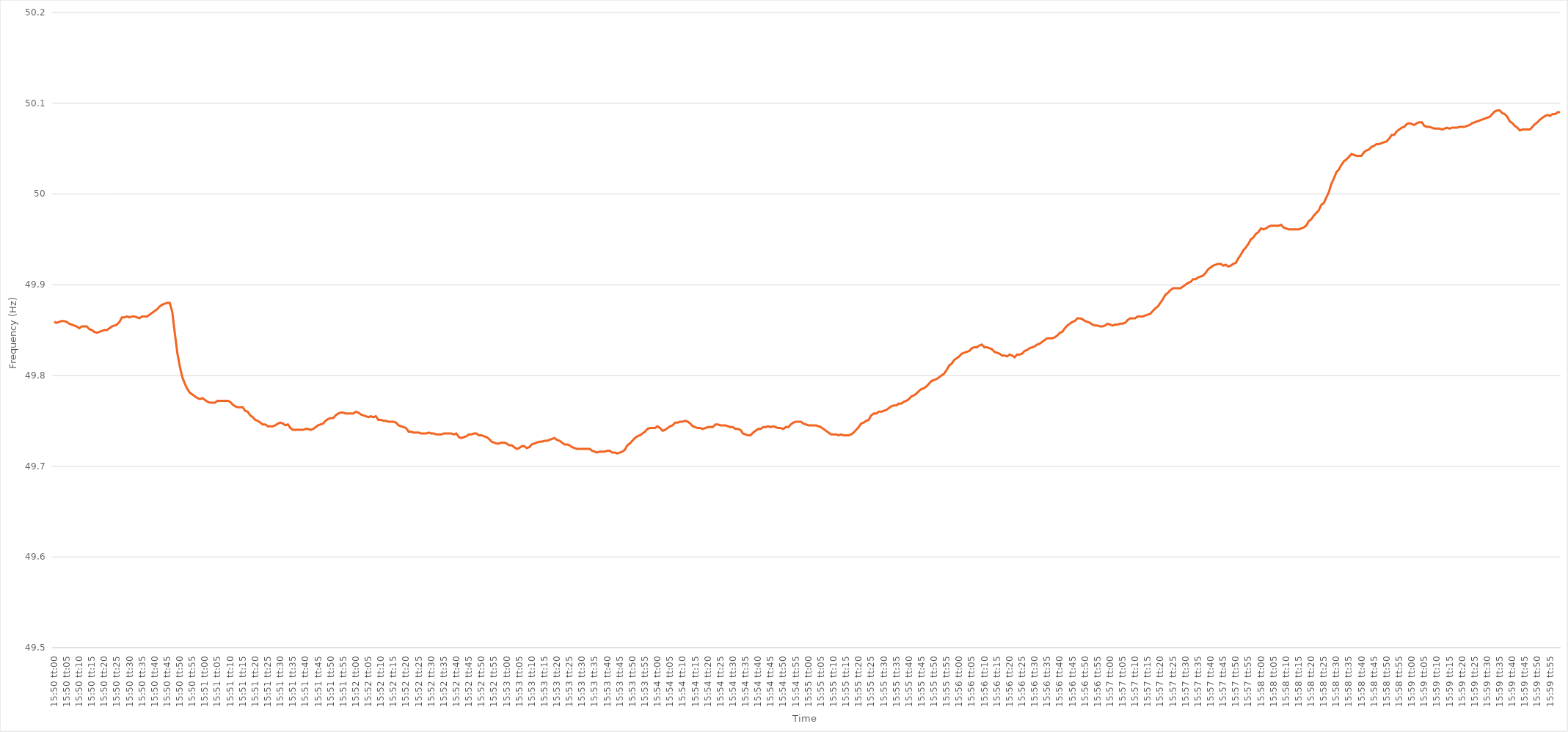
| Category | Series 0 |
|---|---|
| 0.6597222222222222 | 49.859 |
| 0.6597337962962962 | 49.858 |
| 0.6597453703703704 | 49.859 |
| 0.6597569444444444 | 49.86 |
| 0.6597685185185186 | 49.86 |
| 0.6597800925925926 | 49.859 |
| 0.6597916666666667 | 49.857 |
| 0.6598032407407407 | 49.856 |
| 0.6598148148148147 | 49.855 |
| 0.6598263888888889 | 49.854 |
| 0.6598379629629629 | 49.852 |
| 0.6598495370370371 | 49.854 |
| 0.6598611111111111 | 49.854 |
| 0.6598726851851852 | 49.854 |
| 0.6598842592592592 | 49.851 |
| 0.6598958333333333 | 49.85 |
| 0.6599074074074074 | 49.848 |
| 0.6599189814814815 | 49.847 |
| 0.6599305555555556 | 49.848 |
| 0.6599421296296296 | 49.849 |
| 0.6599537037037037 | 49.85 |
| 0.6599652777777778 | 49.85 |
| 0.6599768518518518 | 49.852 |
| 0.659988425925926 | 49.854 |
| 0.66 | 49.855 |
| 0.6600115740740741 | 49.856 |
| 0.6600231481481481 | 49.859 |
| 0.6600347222222223 | 49.864 |
| 0.6600462962962963 | 49.864 |
| 0.6600578703703703 | 49.865 |
| 0.6600694444444445 | 49.864 |
| 0.6600810185185185 | 49.865 |
| 0.6600925925925926 | 49.865 |
| 0.6601041666666666 | 49.864 |
| 0.6601157407407408 | 49.863 |
| 0.6601273148148148 | 49.865 |
| 0.6601388888888889 | 49.865 |
| 0.660150462962963 | 49.865 |
| 0.660162037037037 | 49.867 |
| 0.6601736111111111 | 49.869 |
| 0.6601851851851852 | 49.871 |
| 0.6601967592592592 | 49.873 |
| 0.6602083333333334 | 49.876 |
| 0.6602199074074074 | 49.878 |
| 0.6602314814814815 | 49.879 |
| 0.6602430555555555 | 49.88 |
| 0.6602546296296297 | 49.88 |
| 0.6602662037037037 | 49.87 |
| 0.6602777777777777 | 49.847 |
| 0.6602893518518519 | 49.825 |
| 0.6603009259259259 | 49.81 |
| 0.6603125 | 49.798 |
| 0.660324074074074 | 49.791 |
| 0.6603356481481482 | 49.785 |
| 0.6603472222222222 | 49.781 |
| 0.6603587962962963 | 49.779 |
| 0.6603703703703704 | 49.777 |
| 0.6603819444444444 | 49.775 |
| 0.6603935185185185 | 49.774 |
| 0.6604050925925926 | 49.775 |
| 0.6604166666666667 | 49.773 |
| 0.6604282407407408 | 49.771 |
| 0.6604398148148148 | 49.77 |
| 0.6604513888888889 | 49.77 |
| 0.6604629629629629 | 49.77 |
| 0.6604745370370371 | 49.772 |
| 0.6604861111111111 | 49.772 |
| 0.6604976851851853 | 49.772 |
| 0.6605092592592593 | 49.772 |
| 0.6605208333333333 | 49.772 |
| 0.6605324074074074 | 49.771 |
| 0.6605439814814814 | 49.768 |
| 0.6605555555555556 | 49.766 |
| 0.6605671296296296 | 49.765 |
| 0.6605787037037038 | 49.765 |
| 0.6605902777777778 | 49.765 |
| 0.6606018518518518 | 49.761 |
| 0.6606134259259259 | 49.76 |
| 0.660625 | 49.756 |
| 0.6606365740740741 | 49.754 |
| 0.6606481481481482 | 49.751 |
| 0.6606597222222222 | 49.75 |
| 0.6606712962962963 | 49.748 |
| 0.6606828703703703 | 49.746 |
| 0.6606944444444445 | 49.746 |
| 0.6607060185185185 | 49.744 |
| 0.6607175925925927 | 49.744 |
| 0.6607291666666667 | 49.744 |
| 0.6607407407407407 | 49.745 |
| 0.6607523148148148 | 49.747 |
| 0.6607638888888888 | 49.748 |
| 0.660775462962963 | 49.747 |
| 0.660787037037037 | 49.745 |
| 0.6607986111111112 | 49.746 |
| 0.6608101851851852 | 49.742 |
| 0.6608217592592592 | 49.74 |
| 0.6608333333333333 | 49.74 |
| 0.6608449074074074 | 49.74 |
| 0.6608564814814815 | 49.74 |
| 0.6608680555555556 | 49.74 |
| 0.6608796296296297 | 49.741 |
| 0.6608912037037037 | 49.741 |
| 0.6609027777777777 | 49.74 |
| 0.6609143518518519 | 49.741 |
| 0.6609259259259259 | 49.743 |
| 0.6609375000000001 | 49.745 |
| 0.6609490740740741 | 49.746 |
| 0.6609606481481481 | 49.747 |
| 0.6609722222222222 | 49.75 |
| 0.6609837962962963 | 49.752 |
| 0.6609953703703704 | 49.753 |
| 0.6610069444444444 | 49.753 |
| 0.6610185185185186 | 49.756 |
| 0.6610300925925926 | 49.758 |
| 0.6610416666666666 | 49.759 |
| 0.6610532407407407 | 49.759 |
| 0.6610648148148148 | 49.758 |
| 0.6610763888888889 | 49.758 |
| 0.661087962962963 | 49.758 |
| 0.661099537037037 | 49.758 |
| 0.6611111111111111 | 49.76 |
| 0.6611226851851851 | 49.759 |
| 0.6611342592592593 | 49.757 |
| 0.6611458333333333 | 49.756 |
| 0.6611574074074075 | 49.755 |
| 0.6611689814814815 | 49.754 |
| 0.6611805555555555 | 49.755 |
| 0.6611921296296296 | 49.754 |
| 0.6612037037037037 | 49.755 |
| 0.6612152777777778 | 49.751 |
| 0.6612268518518518 | 49.751 |
| 0.661238425925926 | 49.75 |
| 0.66125 | 49.75 |
| 0.661261574074074 | 49.749 |
| 0.6612731481481481 | 49.749 |
| 0.6612847222222222 | 49.749 |
| 0.6612962962962963 | 49.748 |
| 0.6613078703703704 | 49.745 |
| 0.6613194444444445 | 49.744 |
| 0.6613310185185185 | 49.743 |
| 0.6613425925925925 | 49.742 |
| 0.6613541666666667 | 49.738 |
| 0.6613657407407407 | 49.738 |
| 0.6613773148148149 | 49.737 |
| 0.6613888888888889 | 49.737 |
| 0.661400462962963 | 49.737 |
| 0.661412037037037 | 49.736 |
| 0.6614236111111111 | 49.736 |
| 0.6614351851851852 | 49.736 |
| 0.6614467592592593 | 49.737 |
| 0.6614583333333334 | 49.736 |
| 0.6614699074074074 | 49.736 |
| 0.6614814814814814 | 49.735 |
| 0.6614930555555555 | 49.735 |
| 0.6615046296296296 | 49.735 |
| 0.6615162037037037 | 49.736 |
| 0.6615277777777778 | 49.736 |
| 0.6615393518518519 | 49.736 |
| 0.6615509259259259 | 49.736 |
| 0.6615624999999999 | 49.735 |
| 0.6615740740740741 | 49.736 |
| 0.6615856481481481 | 49.732 |
| 0.6615972222222223 | 49.731 |
| 0.6616087962962963 | 49.732 |
| 0.6616203703703704 | 49.733 |
| 0.6616319444444444 | 49.735 |
| 0.6616435185185185 | 49.735 |
| 0.6616550925925926 | 49.736 |
| 0.6616666666666667 | 49.736 |
| 0.6616782407407408 | 49.734 |
| 0.6616898148148148 | 49.734 |
| 0.6617013888888889 | 49.733 |
| 0.6617129629629629 | 49.732 |
| 0.661724537037037 | 49.73 |
| 0.6617361111111111 | 49.727 |
| 0.6617476851851852 | 49.726 |
| 0.6617592592592593 | 49.725 |
| 0.6617708333333333 | 49.725 |
| 0.6617824074074073 | 49.726 |
| 0.6617939814814815 | 49.726 |
| 0.6618055555555555 | 49.725 |
| 0.6618171296296297 | 49.723 |
| 0.6618287037037037 | 49.723 |
| 0.6618402777777778 | 49.721 |
| 0.6618518518518518 | 49.719 |
| 0.661863425925926 | 49.72 |
| 0.661875 | 49.722 |
| 0.6618865740740741 | 49.722 |
| 0.6618981481481482 | 49.72 |
| 0.6619097222222222 | 49.721 |
| 0.6619212962962963 | 49.724 |
| 0.6619328703703703 | 49.725 |
| 0.6619444444444444 | 49.726 |
| 0.6619560185185185 | 49.727 |
| 0.6619675925925926 | 49.727 |
| 0.6619791666666667 | 49.728 |
| 0.6619907407407407 | 49.728 |
| 0.6620023148148148 | 49.729 |
| 0.6620138888888889 | 49.73 |
| 0.6620254629629629 | 49.731 |
| 0.6620370370370371 | 49.729 |
| 0.6620486111111111 | 49.728 |
| 0.6620601851851852 | 49.726 |
| 0.6620717592592592 | 49.724 |
| 0.6620833333333334 | 49.724 |
| 0.6620949074074074 | 49.723 |
| 0.6621064814814815 | 49.721 |
| 0.6621180555555556 | 49.72 |
| 0.6621296296296296 | 49.719 |
| 0.6621412037037037 | 49.719 |
| 0.6621527777777778 | 49.719 |
| 0.6621643518518519 | 49.719 |
| 0.6621759259259259 | 49.719 |
| 0.6621875 | 49.719 |
| 0.6621990740740741 | 49.717 |
| 0.6622106481481481 | 49.716 |
| 0.6622222222222222 | 49.715 |
| 0.6622337962962963 | 49.716 |
| 0.6622453703703703 | 49.716 |
| 0.6622569444444445 | 49.716 |
| 0.6622685185185185 | 49.717 |
| 0.6622800925925926 | 49.717 |
| 0.6622916666666666 | 49.715 |
| 0.6623032407407408 | 49.715 |
| 0.6623148148148148 | 49.714 |
| 0.662326388888889 | 49.715 |
| 0.662337962962963 | 49.716 |
| 0.662349537037037 | 49.718 |
| 0.6623611111111111 | 49.723 |
| 0.6623726851851852 | 49.725 |
| 0.6623842592592593 | 49.728 |
| 0.6623958333333334 | 49.731 |
| 0.6624074074074074 | 49.733 |
| 0.6624189814814815 | 49.734 |
| 0.6624305555555555 | 49.736 |
| 0.6624421296296296 | 49.738 |
| 0.6624537037037037 | 49.741 |
| 0.6624652777777778 | 49.742 |
| 0.6624768518518519 | 49.742 |
| 0.6624884259259259 | 49.742 |
| 0.6625 | 49.744 |
| 0.662511574074074 | 49.742 |
| 0.6625231481481482 | 49.739 |
| 0.6625347222222222 | 49.74 |
| 0.6625462962962964 | 49.742 |
| 0.6625578703703704 | 49.744 |
| 0.6625694444444444 | 49.745 |
| 0.6625810185185185 | 49.748 |
| 0.6625925925925926 | 49.748 |
| 0.6626041666666667 | 49.749 |
| 0.6626157407407408 | 49.749 |
| 0.6626273148148148 | 49.75 |
| 0.6626388888888889 | 49.749 |
| 0.6626504629629629 | 49.747 |
| 0.662662037037037 | 49.744 |
| 0.6626736111111111 | 49.743 |
| 0.6626851851851852 | 49.742 |
| 0.6626967592592593 | 49.742 |
| 0.6627083333333333 | 49.741 |
| 0.6627199074074074 | 49.742 |
| 0.6627314814814814 | 49.743 |
| 0.6627430555555556 | 49.743 |
| 0.6627546296296296 | 49.743 |
| 0.6627662037037038 | 49.746 |
| 0.6627777777777778 | 49.746 |
| 0.6627893518518518 | 49.745 |
| 0.6628009259259259 | 49.745 |
| 0.6628125 | 49.745 |
| 0.6628240740740741 | 49.744 |
| 0.6628356481481482 | 49.743 |
| 0.6628472222222223 | 49.743 |
| 0.6628587962962963 | 49.741 |
| 0.6628703703703703 | 49.741 |
| 0.6628819444444444 | 49.74 |
| 0.6628935185185185 | 49.736 |
| 0.6629050925925926 | 49.735 |
| 0.6629166666666667 | 49.734 |
| 0.6629282407407407 | 49.734 |
| 0.6629398148148148 | 49.737 |
| 0.6629513888888888 | 49.739 |
| 0.662962962962963 | 49.741 |
| 0.662974537037037 | 49.741 |
| 0.6629861111111112 | 49.743 |
| 0.6629976851851852 | 49.743 |
| 0.6630092592592592 | 49.744 |
| 0.6630208333333333 | 49.743 |
| 0.6630324074074074 | 49.744 |
| 0.6630439814814815 | 49.743 |
| 0.6630555555555556 | 49.742 |
| 0.6630671296296297 | 49.742 |
| 0.6630787037037037 | 49.741 |
| 0.6630902777777777 | 49.743 |
| 0.6631018518518519 | 49.743 |
| 0.6631134259259259 | 49.746 |
| 0.663125 | 49.748 |
| 0.6631365740740741 | 49.749 |
| 0.6631481481481482 | 49.749 |
| 0.6631597222222222 | 49.749 |
| 0.6631712962962962 | 49.747 |
| 0.6631828703703704 | 49.746 |
| 0.6631944444444444 | 49.745 |
| 0.6632060185185186 | 49.745 |
| 0.6632175925925926 | 49.745 |
| 0.6632291666666666 | 49.745 |
| 0.6632407407407407 | 49.744 |
| 0.6632523148148148 | 49.743 |
| 0.6632638888888889 | 49.741 |
| 0.663275462962963 | 49.739 |
| 0.6632870370370371 | 49.737 |
| 0.6632986111111111 | 49.735 |
| 0.6633101851851851 | 49.735 |
| 0.6633217592592593 | 49.735 |
| 0.6633333333333333 | 49.734 |
| 0.6633449074074075 | 49.735 |
| 0.6633564814814815 | 49.734 |
| 0.6633680555555556 | 49.734 |
| 0.6633796296296296 | 49.734 |
| 0.6633912037037036 | 49.735 |
| 0.6634027777777778 | 49.737 |
| 0.6634143518518518 | 49.74 |
| 0.663425925925926 | 49.743 |
| 0.6634375 | 49.747 |
| 0.663449074074074 | 49.748 |
| 0.6634606481481481 | 49.75 |
| 0.6634722222222222 | 49.751 |
| 0.6634837962962963 | 49.756 |
| 0.6634953703703704 | 49.758 |
| 0.6635069444444445 | 49.758 |
| 0.6635185185185185 | 49.76 |
| 0.6635300925925925 | 49.76 |
| 0.6635416666666667 | 49.761 |
| 0.6635532407407407 | 49.762 |
| 0.6635648148148149 | 49.764 |
| 0.6635763888888889 | 49.766 |
| 0.663587962962963 | 49.767 |
| 0.663599537037037 | 49.767 |
| 0.663611111111111 | 49.769 |
| 0.6636226851851852 | 49.769 |
| 0.6636342592592592 | 49.771 |
| 0.6636458333333334 | 49.772 |
| 0.6636574074074074 | 49.774 |
| 0.6636689814814815 | 49.777 |
| 0.6636805555555555 | 49.778 |
| 0.6636921296296296 | 49.78 |
| 0.6637037037037037 | 49.783 |
| 0.6637152777777778 | 49.785 |
| 0.6637268518518519 | 49.786 |
| 0.6637384259259259 | 49.788 |
| 0.66375 | 49.791 |
| 0.6637615740740741 | 49.794 |
| 0.6637731481481481 | 49.795 |
| 0.6637847222222223 | 49.796 |
| 0.6637962962962963 | 49.798 |
| 0.6638078703703704 | 49.8 |
| 0.6638194444444444 | 49.802 |
| 0.6638310185185184 | 49.806 |
| 0.6638425925925926 | 49.811 |
| 0.6638541666666666 | 49.813 |
| 0.6638657407407408 | 49.817 |
| 0.6638773148148148 | 49.819 |
| 0.6638888888888889 | 49.821 |
| 0.6639004629629629 | 49.824 |
| 0.663912037037037 | 49.825 |
| 0.6639236111111111 | 49.826 |
| 0.6639351851851852 | 49.827 |
| 0.6639467592592593 | 49.83 |
| 0.6639583333333333 | 49.831 |
| 0.6639699074074074 | 49.831 |
| 0.6639814814814815 | 49.833 |
| 0.6639930555555555 | 49.834 |
| 0.6640046296296297 | 49.831 |
| 0.6640162037037037 | 49.831 |
| 0.6640277777777778 | 49.83 |
| 0.6640393518518518 | 49.829 |
| 0.664050925925926 | 49.826 |
| 0.6640625 | 49.825 |
| 0.664074074074074 | 49.824 |
| 0.6640856481481482 | 49.822 |
| 0.6640972222222222 | 49.822 |
| 0.6641087962962963 | 49.821 |
| 0.6641203703703703 | 49.823 |
| 0.6641319444444445 | 49.822 |
| 0.6641435185185185 | 49.82 |
| 0.6641550925925926 | 49.823 |
| 0.6641666666666667 | 49.823 |
| 0.6641782407407407 | 49.824 |
| 0.6641898148148148 | 49.827 |
| 0.6642013888888889 | 49.828 |
| 0.664212962962963 | 49.83 |
| 0.6642245370370371 | 49.831 |
| 0.6642361111111111 | 49.832 |
| 0.6642476851851852 | 49.834 |
| 0.6642592592592592 | 49.835 |
| 0.6642708333333334 | 49.837 |
| 0.6642824074074074 | 49.839 |
| 0.6642939814814816 | 49.841 |
| 0.6643055555555556 | 49.841 |
| 0.6643171296296296 | 49.841 |
| 0.6643287037037037 | 49.842 |
| 0.6643402777777777 | 49.844 |
| 0.6643518518518519 | 49.847 |
| 0.6643634259259259 | 49.848 |
| 0.664375 | 49.852 |
| 0.6643865740740741 | 49.855 |
| 0.6643981481481481 | 49.857 |
| 0.6644097222222222 | 49.859 |
| 0.6644212962962963 | 49.86 |
| 0.6644328703703704 | 49.863 |
| 0.6644444444444445 | 49.863 |
| 0.6644560185185185 | 49.862 |
| 0.6644675925925926 | 49.86 |
| 0.6644791666666666 | 49.859 |
| 0.6644907407407408 | 49.858 |
| 0.6645023148148148 | 49.856 |
| 0.664513888888889 | 49.855 |
| 0.664525462962963 | 49.855 |
| 0.664537037037037 | 49.854 |
| 0.6645486111111111 | 49.854 |
| 0.6645601851851851 | 49.855 |
| 0.6645717592592593 | 49.857 |
| 0.6645833333333333 | 49.856 |
| 0.6645949074074075 | 49.855 |
| 0.6646064814814815 | 49.856 |
| 0.6646180555555555 | 49.856 |
| 0.6646296296296296 | 49.857 |
| 0.6646412037037037 | 49.857 |
| 0.6646527777777778 | 49.858 |
| 0.6646643518518519 | 49.861 |
| 0.664675925925926 | 49.863 |
| 0.6646875 | 49.863 |
| 0.664699074074074 | 49.863 |
| 0.6647106481481482 | 49.865 |
| 0.6647222222222222 | 49.865 |
| 0.6647337962962964 | 49.865 |
| 0.6647453703703704 | 49.866 |
| 0.6647569444444444 | 49.867 |
| 0.6647685185185185 | 49.868 |
| 0.6647800925925925 | 49.871 |
| 0.6647916666666667 | 49.874 |
| 0.6648032407407407 | 49.876 |
| 0.6648148148148149 | 49.88 |
| 0.6648263888888889 | 49.884 |
| 0.6648379629629629 | 49.889 |
| 0.664849537037037 | 49.891 |
| 0.6648611111111111 | 49.894 |
| 0.6648726851851852 | 49.896 |
| 0.6648842592592593 | 49.896 |
| 0.6648958333333334 | 49.896 |
| 0.6649074074074074 | 49.896 |
| 0.6649189814814814 | 49.898 |
| 0.6649305555555556 | 49.9 |
| 0.6649421296296296 | 49.902 |
| 0.6649537037037038 | 49.903 |
| 0.6649652777777778 | 49.906 |
| 0.6649768518518518 | 49.906 |
| 0.6649884259259259 | 49.908 |
| 0.665 | 49.909 |
| 0.6650115740740741 | 49.91 |
| 0.6650231481481481 | 49.913 |
| 0.6650347222222223 | 49.917 |
| 0.6650462962962963 | 49.919 |
| 0.6650578703703703 | 49.921 |
| 0.6650694444444444 | 49.922 |
| 0.6650810185185185 | 49.923 |
| 0.6650925925925926 | 49.923 |
| 0.6651041666666667 | 49.921 |
| 0.6651157407407408 | 49.922 |
| 0.6651273148148148 | 49.92 |
| 0.6651388888888888 | 49.921 |
| 0.665150462962963 | 49.923 |
| 0.665162037037037 | 49.924 |
| 0.6651736111111112 | 49.929 |
| 0.6651851851851852 | 49.933 |
| 0.6651967592592593 | 49.938 |
| 0.6652083333333333 | 49.941 |
| 0.6652199074074074 | 49.945 |
| 0.6652314814814815 | 49.95 |
| 0.6652430555555556 | 49.952 |
| 0.6652546296296297 | 49.956 |
| 0.6652662037037037 | 49.958 |
| 0.6652777777777777 | 49.962 |
| 0.6652893518518518 | 49.961 |
| 0.6653009259259259 | 49.962 |
| 0.6653125 | 49.964 |
| 0.6653240740740741 | 49.965 |
| 0.6653356481481482 | 49.965 |
| 0.6653472222222222 | 49.965 |
| 0.6653587962962962 | 49.965 |
| 0.6653703703703704 | 49.966 |
| 0.6653819444444444 | 49.963 |
| 0.6653935185185186 | 49.962 |
| 0.6654050925925926 | 49.961 |
| 0.6654166666666667 | 49.961 |
| 0.6654282407407407 | 49.961 |
| 0.6654398148148148 | 49.961 |
| 0.6654513888888889 | 49.961 |
| 0.665462962962963 | 49.962 |
| 0.6654745370370371 | 49.963 |
| 0.6654861111111111 | 49.965 |
| 0.6654976851851852 | 49.97 |
| 0.6655092592592592 | 49.972 |
| 0.6655208333333333 | 49.976 |
| 0.6655324074074074 | 49.979 |
| 0.6655439814814815 | 49.982 |
| 0.6655555555555556 | 49.988 |
| 0.6655671296296296 | 49.99 |
| 0.6655787037037036 | 49.996 |
| 0.6655902777777778 | 50.002 |
| 0.6656018518518518 | 50.011 |
| 0.665613425925926 | 50.017 |
| 0.665625 | 50.024 |
| 0.6656365740740741 | 50.027 |
| 0.6656481481481481 | 50.032 |
| 0.6656597222222222 | 50.036 |
| 0.6656712962962963 | 50.038 |
| 0.6656828703703704 | 50.041 |
| 0.6656944444444445 | 50.044 |
| 0.6657060185185185 | 50.043 |
| 0.6657175925925926 | 50.042 |
| 0.6657291666666666 | 50.042 |
| 0.6657407407407407 | 50.042 |
| 0.6657523148148148 | 50.046 |
| 0.6657638888888889 | 50.048 |
| 0.665775462962963 | 50.049 |
| 0.665787037037037 | 50.052 |
| 0.665798611111111 | 50.053 |
| 0.6658101851851852 | 50.055 |
| 0.6658217592592592 | 50.055 |
| 0.6658333333333334 | 50.056 |
| 0.6658449074074074 | 50.057 |
| 0.6658564814814815 | 50.058 |
| 0.6658680555555555 | 50.061 |
| 0.6658796296296297 | 50.065 |
| 0.6658912037037037 | 50.065 |
| 0.6659027777777778 | 50.069 |
| 0.6659143518518519 | 50.071 |
| 0.6659259259259259 | 50.073 |
| 0.6659375 | 50.074 |
| 0.6659490740740741 | 50.077 |
| 0.6659606481481481 | 50.078 |
| 0.6659722222222222 | 50.077 |
| 0.6659837962962963 | 50.076 |
| 0.6659953703703704 | 50.078 |
| 0.6660069444444444 | 50.079 |
| 0.6660185185185185 | 50.079 |
| 0.6660300925925926 | 50.075 |
| 0.6660416666666666 | 50.074 |
| 0.6660532407407408 | 50.074 |
| 0.6660648148148148 | 50.073 |
| 0.6660763888888889 | 50.072 |
| 0.6660879629629629 | 50.072 |
| 0.6660995370370371 | 50.072 |
| 0.6661111111111111 | 50.071 |
| 0.6661226851851852 | 50.072 |
| 0.6661342592592593 | 50.073 |
| 0.6661458333333333 | 50.072 |
| 0.6661574074074074 | 50.073 |
| 0.6661689814814815 | 50.073 |
| 0.6661805555555556 | 50.073 |
| 0.6661921296296297 | 50.074 |
| 0.6662037037037037 | 50.074 |
| 0.6662152777777778 | 50.074 |
| 0.6662268518518518 | 50.075 |
| 0.6662384259259259 | 50.076 |
| 0.66625 | 50.078 |
| 0.666261574074074 | 50.079 |
| 0.6662731481481482 | 50.08 |
| 0.6662847222222222 | 50.081 |
| 0.6662962962962963 | 50.082 |
| 0.6663078703703703 | 50.083 |
| 0.6663194444444445 | 50.084 |
| 0.6663310185185185 | 50.085 |
| 0.6663425925925927 | 50.088 |
| 0.6663541666666667 | 50.091 |
| 0.6663657407407407 | 50.092 |
| 0.6663773148148148 | 50.092 |
| 0.6663888888888889 | 50.089 |
| 0.666400462962963 | 50.088 |
| 0.6664120370370371 | 50.085 |
| 0.6664236111111111 | 50.08 |
| 0.6664351851851852 | 50.078 |
| 0.6664467592592592 | 50.075 |
| 0.6664583333333333 | 50.073 |
| 0.6664699074074074 | 50.07 |
| 0.6664814814814815 | 50.071 |
| 0.6664930555555556 | 50.071 |
| 0.6665046296296296 | 50.071 |
| 0.6665162037037037 | 50.071 |
| 0.6665277777777777 | 50.074 |
| 0.6665393518518519 | 50.077 |
| 0.6665509259259259 | 50.079 |
| 0.6665625000000001 | 50.082 |
| 0.6665740740740741 | 50.084 |
| 0.6665856481481481 | 50.086 |
| 0.6665972222222222 | 50.087 |
| 0.6666087962962963 | 50.086 |
| 0.6666203703703704 | 50.088 |
| 0.6666319444444445 | 50.088 |
| 0.6666435185185186 | 50.09 |
| 0.6666550925925926 | 50.09 |